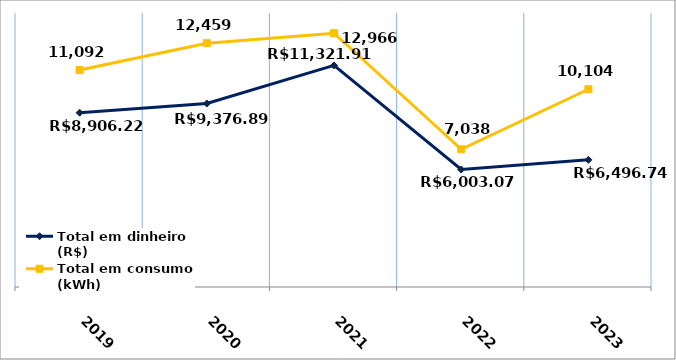
| Category | Total em dinheiro (R$) | Total em consumo (kWh) |
|---|---|---|
| 2019.0 | 8906.22 | 11092 |
| 2020.0 | 9376.89 | 12459 |
| 2021.0 | 11321.91 | 12966 |
| 2022.0 | 6003.07 | 7038 |
| 2023.0 | 6496.74 | 10104 |